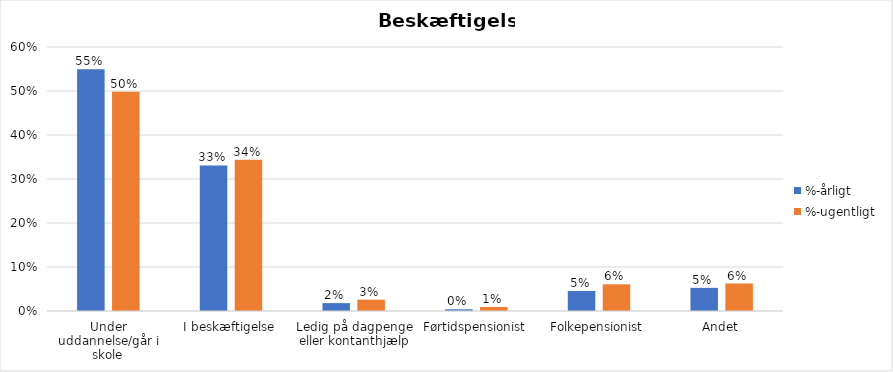
| Category | %-årligt | %-ugentligt |
|---|---|---|
| Under uddannelse/går i skole | 0.549 | 0.498 |
| I beskæftigelse | 0.331 | 0.344 |
| Ledig på dagpenge eller kontanthjælp | 0.018 | 0.026 |
| Førtidspensionist | 0.004 | 0.009 |
| Folkepensionist | 0.046 | 0.061 |
| Andet | 0.053 | 0.062 |